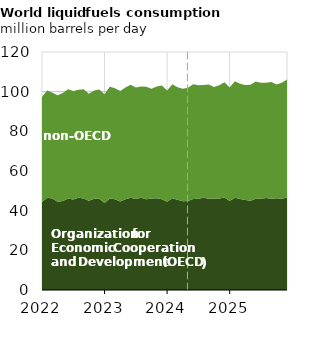
| Category | OECD | non-OECD |
|---|---|---|
| 2022-01-01 | 44.409 | 52.99 |
| 2022-02-01 | 46.563 | 54.058 |
| 2022-03-01 | 46.112 | 53.307 |
| 2022-04-01 | 44.503 | 53.641 |
| 2022-05-01 | 44.911 | 54.475 |
| 2022-06-01 | 46.095 | 55.085 |
| 2022-07-01 | 45.679 | 54.712 |
| 2022-08-01 | 46.539 | 54.453 |
| 2022-09-01 | 46.125 | 55.113 |
| 2022-10-01 | 44.966 | 53.987 |
| 2022-11-01 | 45.992 | 54.546 |
| 2022-12-01 | 45.973 | 55.165 |
| 2023-01-01 | 43.848 | 54.882 |
| 2023-02-01 | 46.079 | 56.376 |
| 2023-03-01 | 45.807 | 55.946 |
| 2023-04-01 | 44.663 | 55.628 |
| 2023-05-01 | 45.811 | 56.296 |
| 2023-06-01 | 46.562 | 56.887 |
| 2023-07-01 | 45.892 | 56.169 |
| 2023-08-01 | 46.508 | 56.078 |
| 2023-09-01 | 45.713 | 56.761 |
| 2023-10-01 | 46.185 | 55.246 |
| 2023-11-01 | 46.254 | 56.376 |
| 2023-12-01 | 45.799 | 57.327 |
| 2024-01-01 | 44.493 | 56.035 |
| 2024-02-01 | 46.243 | 57.444 |
| 2024-03-01 | 45.469 | 56.754 |
| 2024-04-01 | 44.725 | 56.712 |
| 2024-05-01 | 44.886 | 57.148 |
| 2024-06-01 | 45.934 | 57.824 |
| 2024-07-01 | 46.009 | 57.176 |
| 2024-08-01 | 46.532 | 56.797 |
| 2024-09-01 | 45.992 | 57.562 |
| 2024-10-01 | 46.196 | 56.106 |
| 2024-11-01 | 46.083 | 57.176 |
| 2024-12-01 | 46.596 | 58.204 |
| 2025-01-01 | 44.876 | 57.273 |
| 2025-02-01 | 46.497 | 58.718 |
| 2025-03-01 | 45.924 | 58.018 |
| 2025-04-01 | 45.324 | 57.976 |
| 2025-05-01 | 45.006 | 58.425 |
| 2025-06-01 | 46.01 | 59.112 |
| 2025-07-01 | 46.06 | 58.44 |
| 2025-08-01 | 46.421 | 58.049 |
| 2025-09-01 | 46.054 | 58.831 |
| 2025-10-01 | 46.199 | 57.351 |
| 2025-11-01 | 46.043 | 58.444 |
| 2025-12-01 | 46.698 | 59.493 |